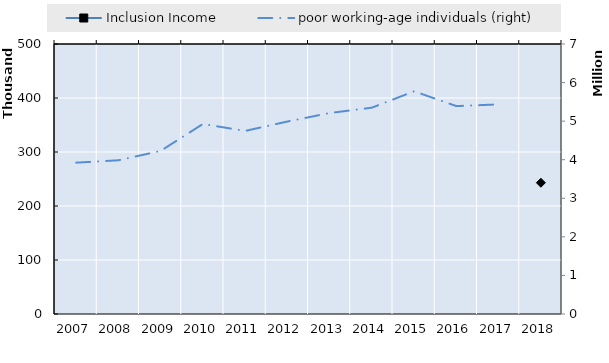
| Category | Inclusion Income | Series 4 | Series 5 | Series 6 | Series 7 | Series 8 | Series 9 | Series 10 | Series 11 | Series 12 | Series 13 | Series 14 | Series 15 | Series 16 | Series 17 | Series 18 | Series 19 |
|---|---|---|---|---|---|---|---|---|---|---|---|---|---|---|---|---|---|
| 2007.0 | 0 |  |  |  |  |  |  |  |  |  |  |  |  |  |  |  |  |
| 2008.0 | 0 |  |  |  |  |  |  |  |  |  |  |  |  |  |  |  |  |
| 2009.0 | 0 |  |  |  |  |  |  |  |  |  |  |  |  |  |  |  |  |
| 2010.0 | 0 |  |  |  |  |  |  |  |  |  |  |  |  |  |  |  |  |
| 2011.0 | 0 |  |  |  |  |  |  |  |  |  |  |  |  |  |  |  |  |
| 2012.0 | 0 |  |  |  |  |  |  |  |  |  |  |  |  |  |  |  |  |
| 2013.0 | 0 |  |  |  |  |  |  |  |  |  |  |  |  |  |  |  |  |
| 2014.0 | 0 |  |  |  |  |  |  |  |  |  |  |  |  |  |  |  |  |
| 2015.0 | 0 |  |  |  |  |  |  |  |  |  |  |  |  |  |  |  |  |
| 2016.0 | 0 |  |  |  |  |  |  |  |  |  |  |  |  |  |  |  |  |
| 2017.0 | 0 |  |  |  |  |  |  |  |  |  |  |  |  |  |  |  |  |
| 2018.0 | 243026.75 |  |  |  |  |  |  |  |  |  |  |  |  |  |  |  |  |